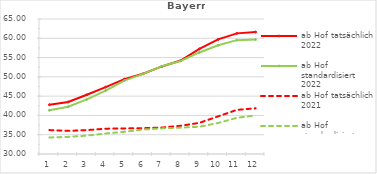
| Category | ab Hof tatsächlich 2022 | ab Hof standardisiert 2022 | ab Hof tatsächlich 2021 | ab Hof standardisiert 2021 |
|---|---|---|---|---|
| 0 | 42.773 | 41.333 | 36.201 | 34.286 |
| 1 | 43.487 | 42.245 | 35.994 | 34.437 |
| 2 | 45.363 | 44.178 | 36.189 | 34.77 |
| 3 | 47.329 | 46.414 | 36.566 | 35.324 |
| 4 | 49.404 | 49.031 | 36.638 | 35.751 |
| 5 | 50.818 | 50.785 | 36.688 | 36.357 |
| 6 | 52.7 | 52.766 | 36.857 | 36.639 |
| 7 | 54.223 | 54.121 | 37.322 | 36.836 |
| 8 | 57.236 | 56.329 | 38.067 | 37.067 |
| 9 | 59.714 | 58.204 | 39.755 | 38.048 |
| 10 | 61.273 | 59.517 | 41.443 | 39.383 |
| 11 | 61.62 | 59.669 | 41.845 | 40.006 |